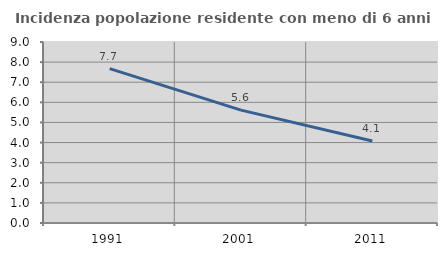
| Category | Incidenza popolazione residente con meno di 6 anni |
|---|---|
| 1991.0 | 7.678 |
| 2001.0 | 5.614 |
| 2011.0 | 4.073 |